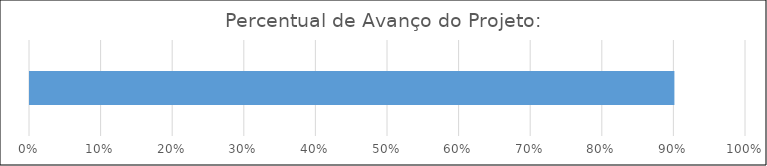
| Category | Percentual: |
|---|---|
| 0 | 0.9 |